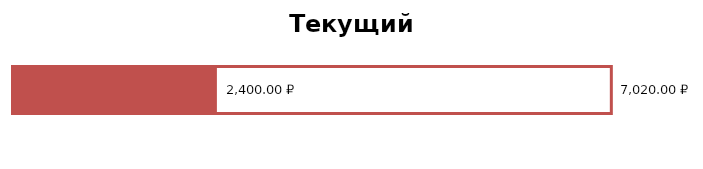
| Category | Общий доход | Общие расходы |
|---|---|---|
| 0 | 7020 | 2400 |